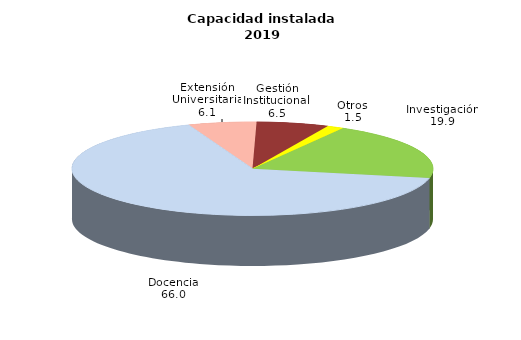
| Category | Series 0 |
|---|---|
| Investigación | 19.895 |
| Docencia | 66.008 |
| Extensión Universitaria | 6.126 |
| Gestión Institucional | 6.456 |
| Otros | 1.515 |